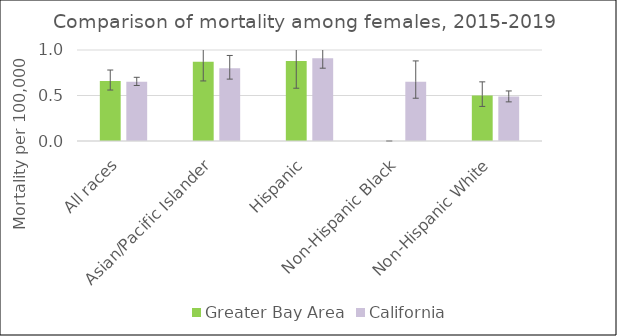
| Category | Greater Bay Area | California | US Mortality |
|---|---|---|---|
| All races | 0.66 | 0.65 |  |
| Asian/Pacific Islander | 0.87 | 0.8 |  |
| Hispanic | 0.88 | 0.91 |  |
| Non-Hispanic Black | 0 | 0.65 |  |
| Non-Hispanic White | 0.5 | 0.49 |  |